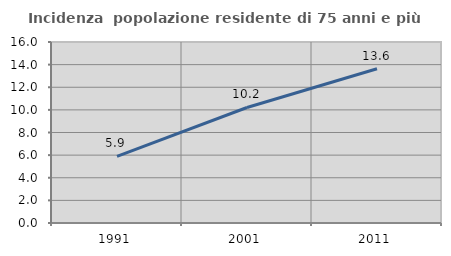
| Category | Incidenza  popolazione residente di 75 anni e più |
|---|---|
| 1991.0 | 5.89 |
| 2001.0 | 10.21 |
| 2011.0 | 13.64 |